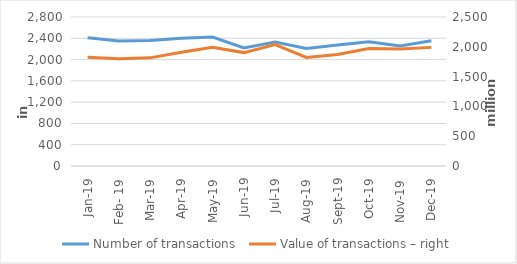
| Category | Number of transactions  |
|---|---|
| sij.19 | 2409937 |
| Feb- 19 | 2350517 |
| ožu.19 | 2356681 |
| Apr-19 | 2401158 |
| svi.19 | 2423197 |
| lip.19 | 2219484 |
| srp.19 | 2328250 |
| kol.19 | 2209532 |
| ruj.19 | 2271690 |
| lis.19 | 2333508 |
| stu.19 | 2253175 |
| Dec-19 | 2354441 |